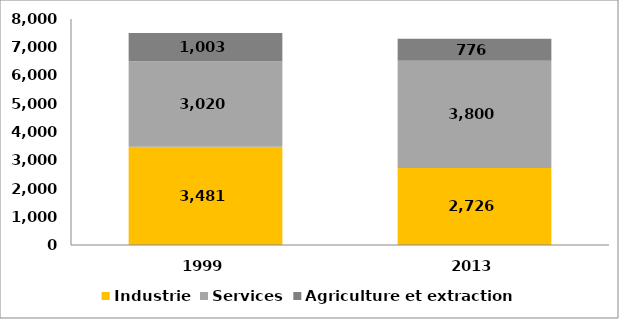
| Category | Industrie | Services | Agriculture et extraction |
|---|---|---|---|
| 1999.0 | 3481 | 3020 | 1003 |
| 2013.0 | 2726 | 3800 | 776 |